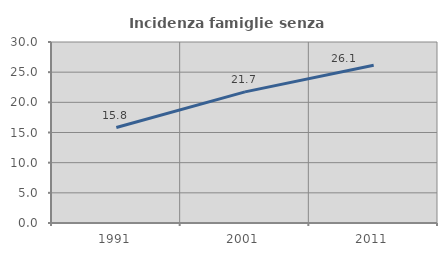
| Category | Incidenza famiglie senza nuclei |
|---|---|
| 1991.0 | 15.827 |
| 2001.0 | 21.734 |
| 2011.0 | 26.148 |